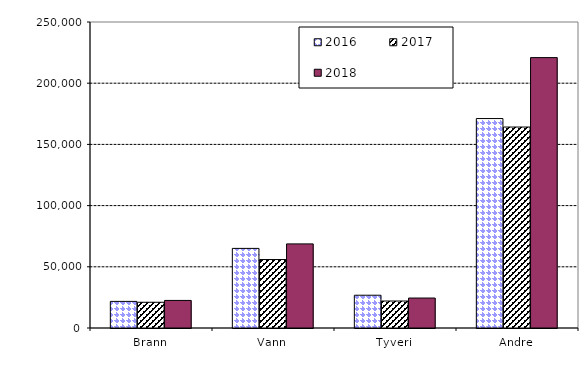
| Category | 2016 | 2017 | 2018 |
|---|---|---|---|
| Brann | 21734.71 | 21024.265 | 22519.979 |
| Vann | 65032.459 | 55947.099 | 68720.093 |
| Tyveri | 26773.593 | 22044.151 | 24478.981 |
| Andre | 171109.097 | 164180.707 | 220900.126 |